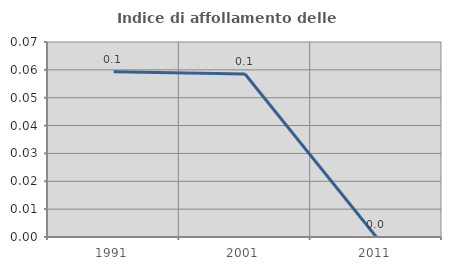
| Category | Indice di affollamento delle abitazioni  |
|---|---|
| 1991.0 | 0.059 |
| 2001.0 | 0.059 |
| 2011.0 | 0 |